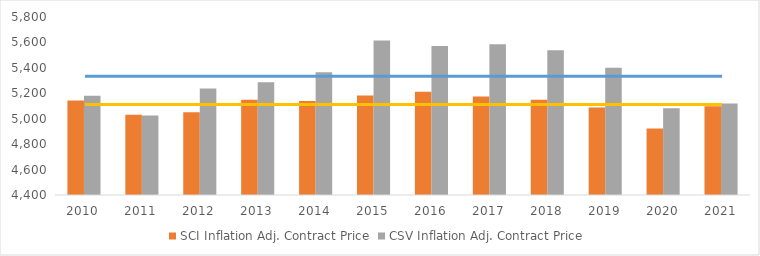
| Category | SCI Inflation Adj. Contract Price | CSV Inflation Adj. Contract Price |
|---|---|---|
| 2010.0 | 5143.644 | 5181.031 |
| 2011.0 | 5032.145 | 5025.359 |
| 2012.0 | 5051.47 | 5238.598 |
| 2013.0 | 5148.584 | 5287.548 |
| 2014.0 | 5138.641 | 5365.954 |
| 2015.0 | 5181.854 | 5614.341 |
| 2016.0 | 5212.242 | 5571.707 |
| 2017.0 | 5173.793 | 5586.012 |
| 2018.0 | 5149.225 | 5538.711 |
| 2019.0 | 5087.799 | 5401.121 |
| 2020.0 | 4922.279 | 5082.305 |
| 2021.0 | 5097.523 | 5119.491 |